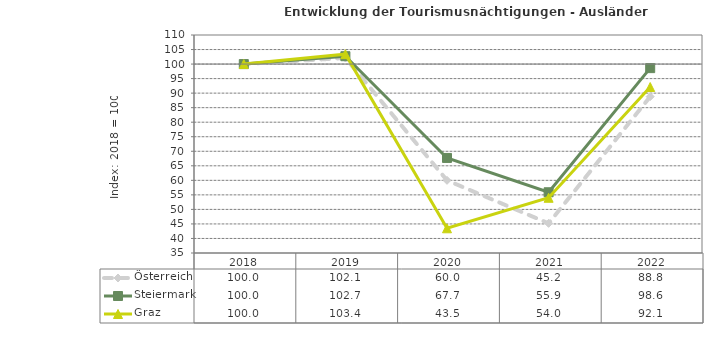
| Category | Österreich | Steiermark | Graz |
|---|---|---|---|
| 2022.0 | 88.8 | 98.6 | 92.1 |
| 2021.0 | 45.2 | 55.9 | 54 |
| 2020.0 | 60 | 67.7 | 43.5 |
| 2019.0 | 102.1 | 102.7 | 103.4 |
| 2018.0 | 100 | 100 | 100 |